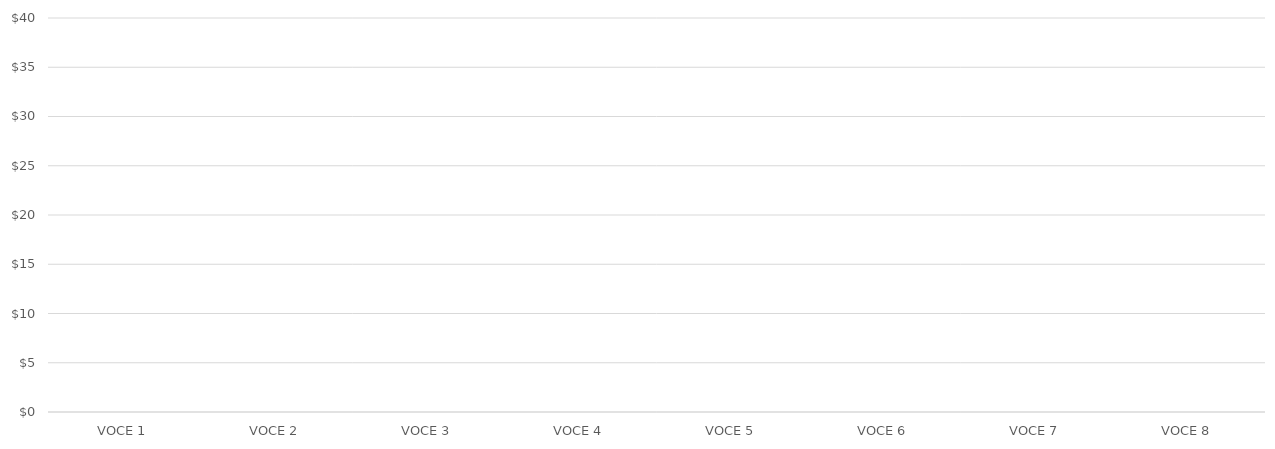
| Category | PROFITTI PER VOCE |
|---|---|
| VOCE 1 | 0 |
| VOCE 2 | 0 |
| VOCE 3 | 0 |
| VOCE 4 | 0 |
| VOCE 5 | 0 |
| VOCE 6 | 0 |
| VOCE 7 | 0 |
| VOCE 8 | 0 |